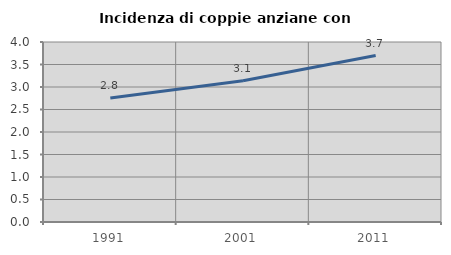
| Category | Incidenza di coppie anziane con figli |
|---|---|
| 1991.0 | 2.756 |
| 2001.0 | 3.14 |
| 2011.0 | 3.698 |